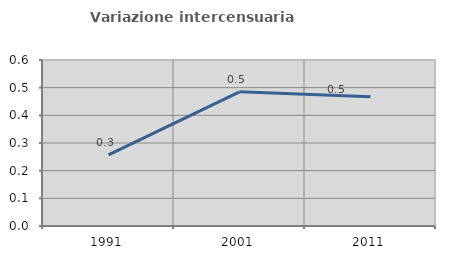
| Category | Variazione intercensuaria annua |
|---|---|
| 1991.0 | 0.257 |
| 2001.0 | 0.485 |
| 2011.0 | 0.467 |